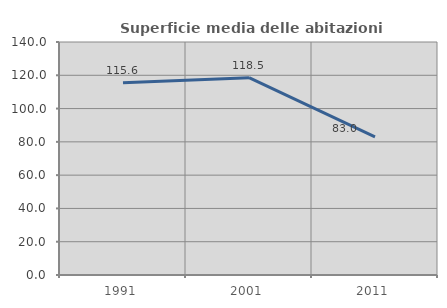
| Category | Superficie media delle abitazioni occupate |
|---|---|
| 1991.0 | 115.571 |
| 2001.0 | 118.533 |
| 2011.0 | 83 |